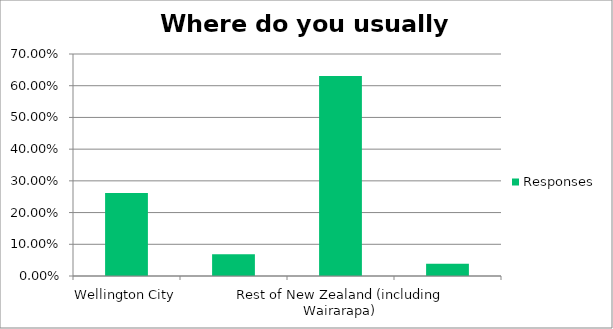
| Category | Responses |
|---|---|
| Wellington City | 0.262 |
| Wellington Region (Kāpiti, Hutt City, Upper Hutt, Porirua) | 0.069 |
| Rest of New Zealand (including Wairarapa) | 0.631 |
| Overseas (not in New Zealand) | 0.039 |